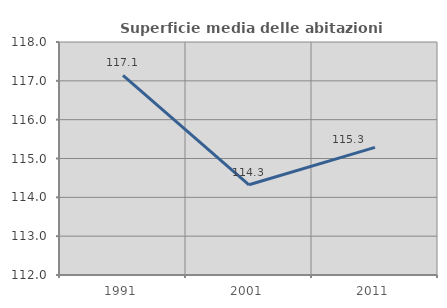
| Category | Superficie media delle abitazioni occupate |
|---|---|
| 1991.0 | 117.141 |
| 2001.0 | 114.324 |
| 2011.0 | 115.288 |